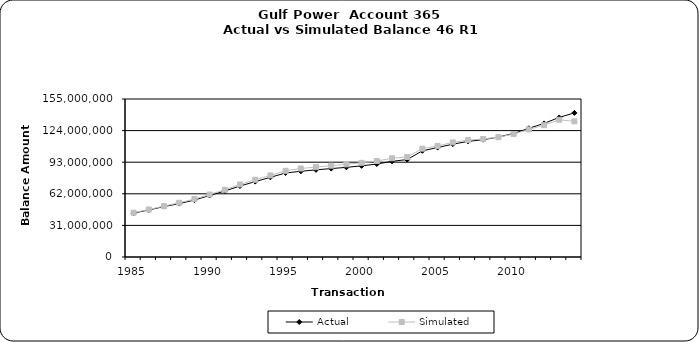
| Category | Actual | Simulated |
|---|---|---|
| 1985.0 | 43053606.34 | 43473857.155 |
| 1986.0 | 46150669.56 | 46571058.914 |
| 1987.0 | 49453774.14 | 49913553.743 |
| 1988.0 | 52361643.17 | 53214586.106 |
| 1989.0 | 55856306.1 | 56789232.794 |
| 1990.0 | 60341210.42 | 61297494.886 |
| 1991.0 | 64713602.42 | 65958494.427 |
| 1992.0 | 69640996.32 | 71186615.937 |
| 1993.0 | 73936547.19 | 75788974.764 |
| 1994.0 | 78153379.86 | 80031204.791 |
| 1995.0 | 82430299.9 | 84537386.622 |
| 1996.0 | 84087541.08 | 86828860.403 |
| 1997.0 | 85507769.08 | 88147091.455 |
| 1998.0 | 86738830.08 | 89608978.24 |
| 1999.0 | 87968289.08 | 90883111.412 |
| 2000.0 | 89414533.08 | 92374331.275 |
| 2001.0 | 91190684.78 | 94205641.762 |
| 2002.0 | 93883257.03 | 96829397.936 |
| 2003.0 | 95574316.73 | 98131190.591 |
| 2004.0 | 104182986.53 | 106298704.247 |
| 2005.0 | 107361370.53 | 108942296.259 |
| 2006.0 | 110697328.53 | 112417631.482 |
| 2007.0 | 113403044.53 | 114683401.059 |
| 2008.0 | 115071323.53 | 115812265.491 |
| 2009.0 | 117679022.78 | 117552140.878 |
| 2010.0 | 121153914.39 | 120606521.95 |
| 2011.0 | 126258110.99 | 125151879.09 |
| 2012.0 | 131065267.26 | 129323826.842 |
| 2013.0 | 136905621.65 | 134671758.889 |
| 2014.0 | 141411299.12 | 133068199.828 |